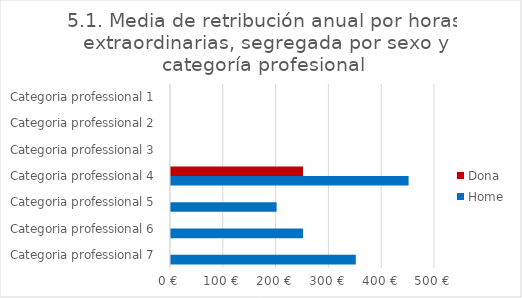
| Category | Dona | Home |
|---|---|---|
| Categoria professional 1 | 0 | 0 |
| Categoria professional 2 | 0 | 0 |
| Categoria professional 3 | 0 | 0 |
| Categoria professional 4 | 250 | 450 |
| Categoria professional 5 | 0 | 200 |
| Categoria professional 6 | 0 | 250 |
| Categoria professional 7 | 0 | 350 |